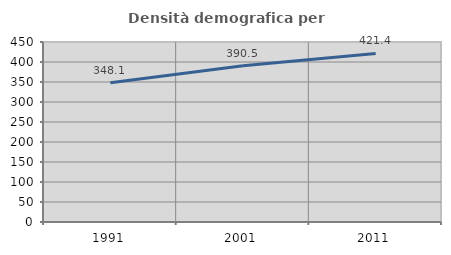
| Category | Densità demografica |
|---|---|
| 1991.0 | 348.088 |
| 2001.0 | 390.544 |
| 2011.0 | 421.421 |